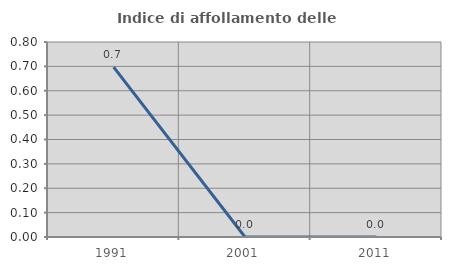
| Category | Indice di affollamento delle abitazioni  |
|---|---|
| 1991.0 | 0.697 |
| 2001.0 | 0 |
| 2011.0 | 0 |